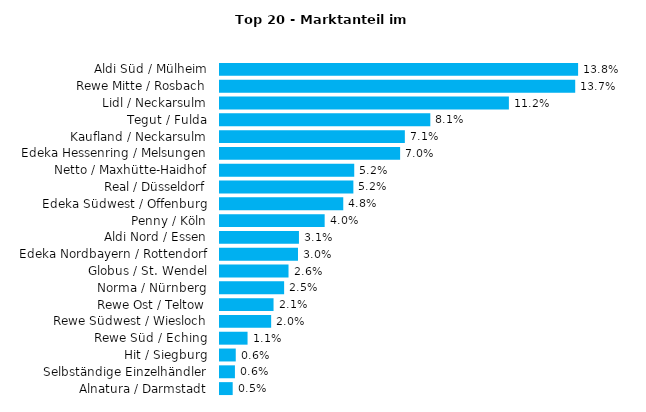
| Category | Series 0 |
|---|---|
| Aldi Süd / Mülheim | 0.138 |
| Rewe Mitte / Rosbach | 0.137 |
| Lidl / Neckarsulm | 0.112 |
| Tegut / Fulda | 0.081 |
| Kaufland / Neckarsulm | 0.071 |
| Edeka Hessenring / Melsungen | 0.07 |
| Netto / Maxhütte-Haidhof | 0.052 |
| Real / Düsseldorf | 0.052 |
| Edeka Südwest / Offenburg | 0.048 |
| Penny / Köln | 0.04 |
| Aldi Nord / Essen | 0.031 |
| Edeka Nordbayern / Rottendorf | 0.03 |
| Globus / St. Wendel | 0.026 |
| Norma / Nürnberg | 0.025 |
| Rewe Ost / Teltow | 0.021 |
| Rewe Südwest / Wiesloch | 0.02 |
| Rewe Süd / Eching | 0.011 |
| Hit / Siegburg | 0.006 |
| Selbständige Einzelhändler | 0.006 |
| Alnatura / Darmstadt | 0.005 |